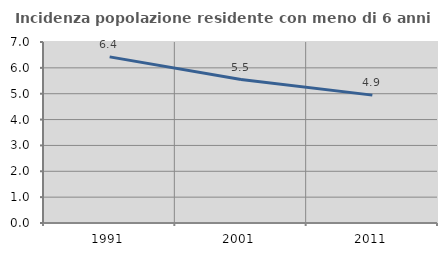
| Category | Incidenza popolazione residente con meno di 6 anni |
|---|---|
| 1991.0 | 6.425 |
| 2001.0 | 5.546 |
| 2011.0 | 4.946 |